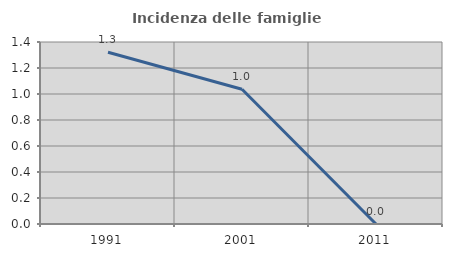
| Category | Incidenza delle famiglie numerose |
|---|---|
| 1991.0 | 1.322 |
| 2001.0 | 1.036 |
| 2011.0 | 0 |